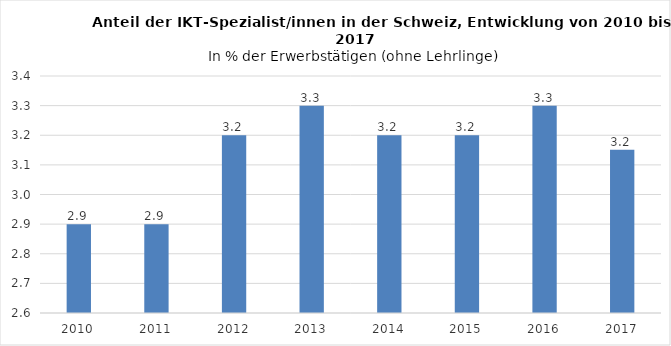
| Category | In % |
|---|---|
| 2010.0 | 2.9 |
| 2011.0 | 2.9 |
| 2012.0 | 3.2 |
| 2013.0 | 3.3 |
| 2014.0 | 3.2 |
| 2015.0 | 3.2 |
| 2016.0 | 3.3 |
| 2017.0 | 3.151 |